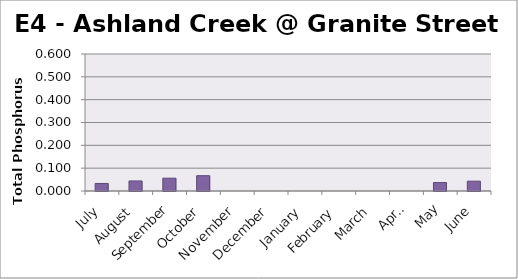
| Category | Phosphorus (mg/L) |
|---|---|
| July | 0.033 |
| August | 0.044 |
| September | 0.056 |
| October | 0.067 |
| November | 0 |
| December | 0 |
| January | 0 |
| February | 0 |
| March | 0 |
| April | 0 |
| May | 0.037 |
| June | 0.043 |